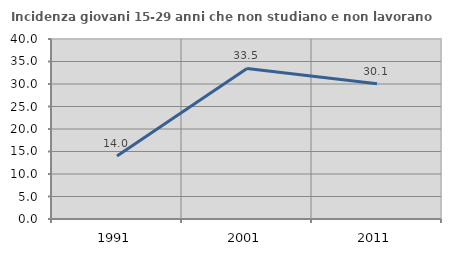
| Category | Incidenza giovani 15-29 anni che non studiano e non lavorano  |
|---|---|
| 1991.0 | 14 |
| 2001.0 | 33.466 |
| 2011.0 | 30.08 |